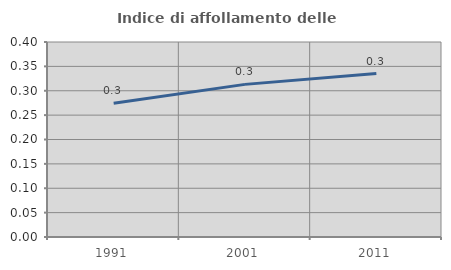
| Category | Indice di affollamento delle abitazioni  |
|---|---|
| 1991.0 | 0.275 |
| 2001.0 | 0.313 |
| 2011.0 | 0.335 |